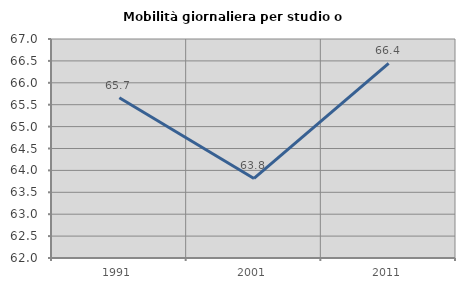
| Category | Mobilità giornaliera per studio o lavoro |
|---|---|
| 1991.0 | 65.66 |
| 2001.0 | 63.816 |
| 2011.0 | 66.442 |